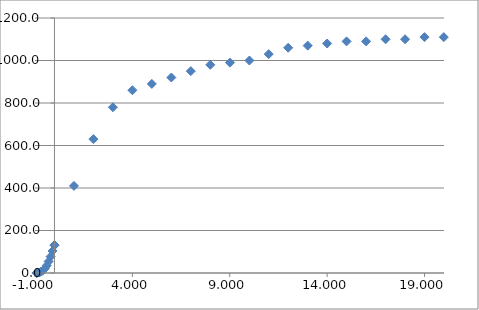
| Category | Series 0 |
|---|---|
| -0.925 | 0 |
| -0.9 | 0.3 |
| -0.8 | 2.3 |
| -0.7 | 5.5 |
| -0.6 | 11 |
| -0.5 | 20.1 |
| -0.4 | 34.9 |
| -0.3 | 54.3 |
| -0.2 | 77 |
| -0.1 | 103.6 |
| 0.0 | 132 |
| 0.0 | 130.4 |
| 1.0 | 410 |
| 2.0 | 630 |
| 3.0 | 780 |
| 4.0 | 860 |
| 5.0 | 890 |
| 6.0 | 920 |
| 7.0 | 950 |
| 8.0 | 980 |
| 9.01 | 990 |
| 10.01 | 1000 |
| 11.0 | 1030 |
| 12.0 | 1060 |
| 13.0 | 1070 |
| 14.0 | 1080 |
| 15.0 | 1090 |
| 16.0 | 1090 |
| 17.0 | 1100 |
| 18.0 | 1100 |
| 19.0 | 1110 |
| 19.99 | 1110 |